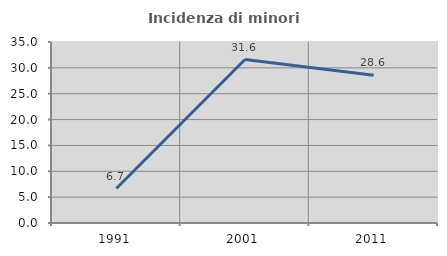
| Category | Incidenza di minori stranieri |
|---|---|
| 1991.0 | 6.667 |
| 2001.0 | 31.615 |
| 2011.0 | 28.592 |